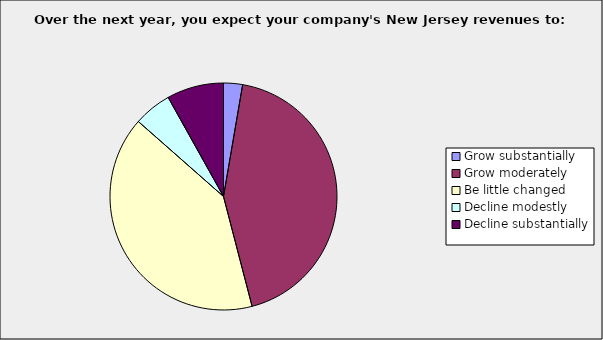
| Category | Series 0 |
|---|---|
| Grow substantially | 0.027 |
| Grow moderately | 0.432 |
| Be little changed | 0.405 |
| Decline modestly | 0.054 |
| Decline substantially | 0.081 |